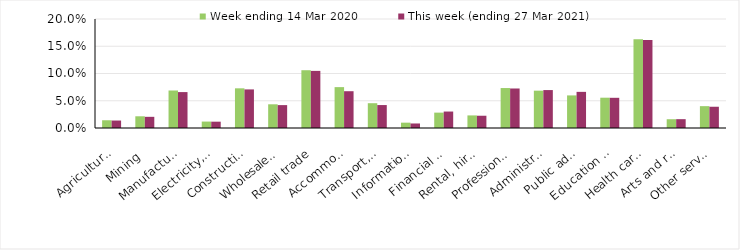
| Category | Week ending 14 Mar 2020 | This week (ending 27 Mar 2021) |
|---|---|---|
| Agriculture, forestry and fishing | 0.014 | 0.014 |
| Mining | 0.022 | 0.02 |
| Manufacturing | 0.069 | 0.066 |
| Electricity, gas, water and waste services | 0.012 | 0.012 |
| Construction | 0.073 | 0.071 |
| Wholesale trade | 0.044 | 0.042 |
| Retail trade | 0.106 | 0.105 |
| Accommodation and food services | 0.075 | 0.068 |
| Transport, postal and warehousing | 0.046 | 0.042 |
| Information media and telecommunications | 0.01 | 0.008 |
| Financial and insurance services | 0.028 | 0.03 |
| Rental, hiring and real estate services | 0.023 | 0.022 |
| Professional, scientific and technical services | 0.073 | 0.072 |
| Administrative and support services | 0.068 | 0.07 |
| Public administration and safety | 0.06 | 0.066 |
| Education and training | 0.056 | 0.055 |
| Health care and social assistance | 0.163 | 0.161 |
| Arts and recreation services | 0.016 | 0.016 |
| Other services | 0.04 | 0.039 |